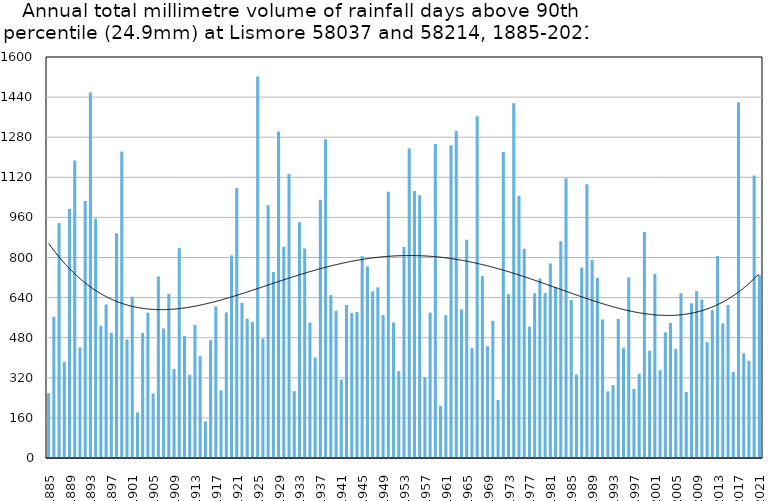
| Category | Annual total mm in days above 90th percentile |
|---|---|
| 1885 | 258.9 |
| 1886 | 563.5 |
| 1887 | 937.3 |
| 1888 | 384 |
| 1889 | 993.9 |
| 1890 | 1186.7 |
| 1891 | 441.9 |
| 1892 | 1025.3 |
| 1893 | 1458.8 |
| 1894 | 955.2 |
| 1895 | 527.4 |
| 1896 | 612.4 |
| 1897 | 499.3 |
| 1898 | 896.9 |
| 1899 | 1222.5 |
| 1900 | 473.2 |
| 1901 | 643.5 |
| 1902 | 181.9 |
| 1903 | 498.6 |
| 1904 | 580.1 |
| 1905 | 257.2 |
| 1906 | 724.5 |
| 1907 | 516.6 |
| 1908 | 655 |
| 1909 | 355.8 |
| 1910 | 838.1 |
| 1911 | 487.5 |
| 1912 | 332 |
| 1913 | 530.9 |
| 1914 | 406.8 |
| 1915 | 146.2 |
| 1916 | 470 |
| 1917 | 604.4 |
| 1918 | 269.5 |
| 1919 | 580.8 |
| 1920 | 809.4 |
| 1921 | 1077.7 |
| 1922 | 619.1 |
| 1923 | 556.1 |
| 1924 | 543.2 |
| 1925 | 1522.4 |
| 1926 | 476.6 |
| 1927 | 1008.9 |
| 1928 | 741.7 |
| 1929 | 1302.9 |
| 1930 | 843 |
| 1931 | 1132.7 |
| 1932 | 266.5 |
| 1933 | 940.4 |
| 1934 | 835.9 |
| 1935 | 539.9 |
| 1936 | 400.7 |
| 1937 | 1030.5 |
| 1938 | 1272.3 |
| 1939 | 649.9 |
| 1940 | 587.3 |
| 1941 | 313 |
| 1942 | 610.7 |
| 1943 | 578.5 |
| 1944 | 582.4 |
| 1945 | 805.7 |
| 1946 | 765.2 |
| 1947 | 665 |
| 1948 | 681.2 |
| 1949 | 570.1 |
| 1950 | 1062.8 |
| 1951 | 540.3 |
| 1952 | 346.5 |
| 1953 | 842 |
| 1954 | 1234.7 |
| 1955 | 1065.1 |
| 1956 | 1048.5 |
| 1957 | 322.5 |
| 1958 | 580.3 |
| 1959 | 1252.6 |
| 1960 | 207.3 |
| 1961 | 569.9 |
| 1962 | 1248 |
| 1963 | 1304.9 |
| 1964 | 592.3 |
| 1965 | 871.2 |
| 1966 | 438.7 |
| 1967 | 1363.7 |
| 1968 | 726.4 |
| 1969 | 446.2 |
| 1970 | 547.4 |
| 1971 | 230.9 |
| 1972 | 1220.6 |
| 1973 | 653.1 |
| 1974 | 1415.3 |
| 1975 | 1046 |
| 1976 | 835 |
| 1977 | 524 |
| 1978 | 657.4 |
| 1979 | 716.2 |
| 1980 | 658.2 |
| 1981 | 776.4 |
| 1982 | 682.4 |
| 1983 | 864.9 |
| 1984 | 1116.4 |
| 1985 | 630.2 |
| 1986 | 332.8 |
| 1987 | 759.6 |
| 1988 | 1091.9 |
| 1989 | 789.9 |
| 1990 | 719.2 |
| 1991 | 553 |
| 1992 | 265.8 |
| 1993 | 290.8 |
| 1994 | 554.6 |
| 1995 | 440.4 |
| 1996 | 720.8 |
| 1997 | 275.2 |
| 1998 | 336.2 |
| 1999 | 901.6 |
| 2000 | 428.4 |
| 2001 | 734.8 |
| 2002 | 350.3 |
| 2003 | 501.8 |
| 2004 | 538.6 |
| 2005 | 436 |
| 2006 | 657.8 |
| 2007 | 263.8 |
| 2008 | 617.4 |
| 2009 | 665.8 |
| 2010 | 632.4 |
| 2011 | 462.6 |
| 2012 | 590.2 |
| 2013 | 805.8 |
| 2014 | 537.2 |
| 2015 | 610.8 |
| 2016 | 343 |
| 2017 | 1419.2 |
| 2018 | 418 |
| 2019 | 388.2 |
| 2020 | 1127.4 |
| 2021 | 729.8 |